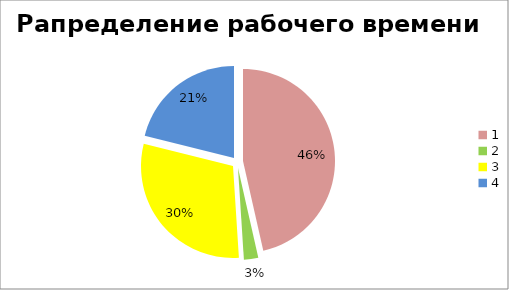
| Category | Series 0 |
|---|---|
| 0 | 0.205 |
| 1 | 0.011 |
| 2 | 0.132 |
| 3 | 0.093 |